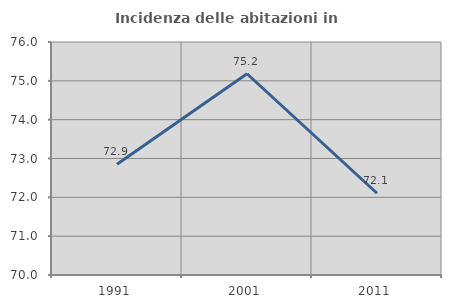
| Category | Incidenza delle abitazioni in proprietà  |
|---|---|
| 1991.0 | 72.853 |
| 2001.0 | 75.182 |
| 2011.0 | 72.105 |